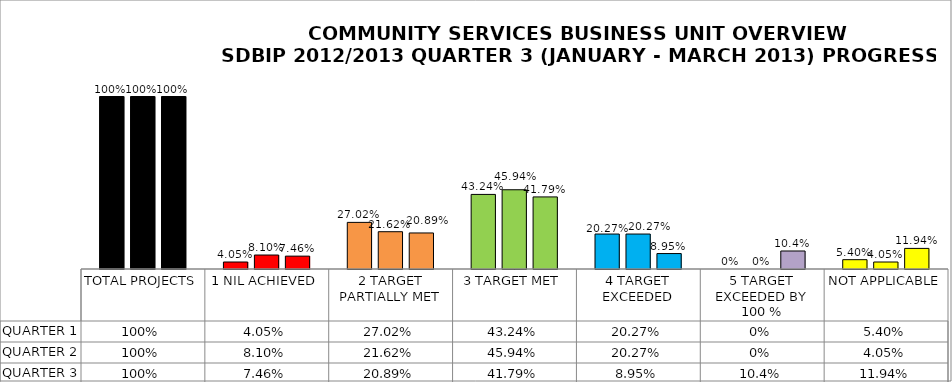
| Category | QUARTER 1 | QUARTER 2 | QUARTER 3 |
|---|---|---|---|
| TOTAL PROJECTS | 1 | 1 | 1 |
| 1 NIL ACHIEVED | 0.04 | 0.081 | 0.075 |
| 2 TARGET PARTIALLY MET | 0.27 | 0.216 | 0.209 |
| 3 TARGET MET | 0.432 | 0.459 | 0.418 |
| 4 TARGET EXCEEDED | 0.203 | 0.203 | 0.09 |
| 5 TARGET EXCEEDED BY 100 % | 0 | 0 | 0.104 |
| NOT APPLICABLE | 0.054 | 0.04 | 0.119 |